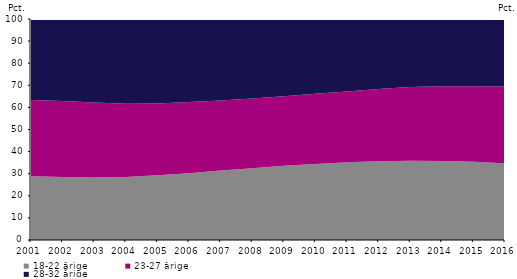
| Category | 18-22 årige | 23-27 årige | 28-32 årige |
|---|---|---|---|
| 2001.0 | 28.8 | 34.5 | 36.6 |
| 2002.0 | 28.5 | 34.4 | 37.1 |
| 2003.0 | 28.3 | 33.9 | 37.8 |
| 2004.0 | 28.5 | 33.1 | 38.4 |
| 2005.0 | 29.3 | 32.5 | 38.1 |
| 2006.0 | 30.2 | 32.3 | 37.5 |
| 2007.0 | 31.4 | 31.7 | 36.9 |
| 2008.0 | 32.5 | 31.5 | 36 |
| 2009.0 | 33.6 | 31.5 | 34.9 |
| 2010.0 | 34.4 | 31.8 | 33.8 |
| 2011.0 | 35.2 | 32 | 32.8 |
| 2012.0 | 35.6 | 32.7 | 31.7 |
| 2013.0 | 35.9 | 33.3 | 30.9 |
| 2014.0 | 35.8 | 33.8 | 30.4 |
| 2015.0 | 35.4 | 34.2 | 30.4 |
| 2016.0 | 34.7 | 34.8 | 30.5 |